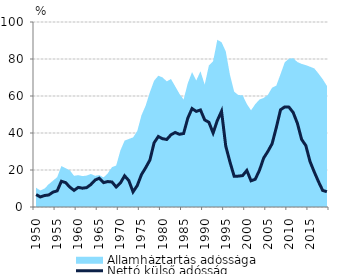
| Category | Nettó külső adósság |
|---|---|
| 1950.0 | 6.728 |
| 1951.0 | 5.438 |
| 1952.0 | 6.2 |
| 1953.0 | 6.504 |
| 1954.0 | 8.04 |
| 1955.0 | 8.719 |
| 1956.0 | 13.915 |
| 1957.0 | 13.187 |
| 1958.0 | 10.752 |
| 1959.0 | 8.988 |
| 1960.0 | 10.599 |
| 1961.0 | 10.168 |
| 1962.0 | 10.481 |
| 1963.0 | 12.162 |
| 1964.0 | 14.583 |
| 1965.0 | 15.564 |
| 1966.0 | 13.183 |
| 1967.0 | 13.754 |
| 1968.0 | 13.516 |
| 1969.0 | 10.821 |
| 1970.0 | 12.98 |
| 1971.0 | 16.852 |
| 1972.0 | 14.275 |
| 1973.0 | 8.183 |
| 1974.0 | 11.578 |
| 1975.0 | 17.5 |
| 1976.0 | 21.258 |
| 1977.0 | 25.358 |
| 1978.0 | 34.735 |
| 1979.0 | 38.098 |
| 1980.0 | 36.929 |
| 1981.0 | 36.501 |
| 1982.0 | 39.034 |
| 1983.0 | 40.288 |
| 1984.0 | 39.305 |
| 1985.0 | 39.724 |
| 1986.0 | 48.084 |
| 1987.0 | 53.224 |
| 1988.0 | 51.699 |
| 1989.0 | 52.465 |
| 1990.0 | 47.076 |
| 1991.0 | 45.805 |
| 1992.0 | 40.021 |
| 1993.0 | 46.739 |
| 1994.0 | 51.766 |
| 1995.0 | 32.945 |
| 1996.0 | 24.308 |
| 1997.0 | 16.603 |
| 1998.0 | 16.692 |
| 1999.0 | 16.964 |
| 2000.0 | 19.751 |
| 2001.0 | 14.158 |
| 2002.0 | 15.005 |
| 2003.0 | 19.854 |
| 2004.0 | 26.48 |
| 2005.0 | 30.081 |
| 2006.0 | 34.202 |
| 2007.0 | 42.983 |
| 2008.0 | 52.559 |
| 2009.0 | 54.102 |
| 2010.0 | 53.985 |
| 2011.0 | 51.074 |
| 2012.0 | 45.243 |
| 2013.0 | 36.549 |
| 2014.0 | 33.216 |
| 2015.0 | 24.559 |
| 2016.0 | 18.956 |
| 2017.0 | 13.735 |
| 2018.0 | 8.95 |
| 2019.0 | 8.267 |